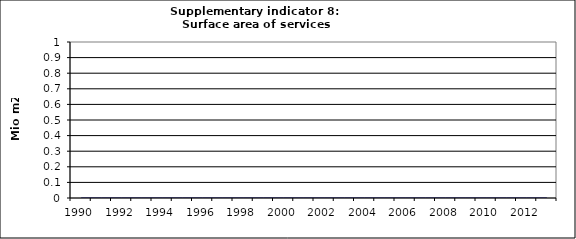
| Category | Surface area of services buildings, Mio m2 |
|---|---|
| 1990 | 0 |
| 1991 | 0 |
| 1992 | 0 |
| 1993 | 0 |
| 1994 | 0 |
| 1995 | 0 |
| 1996 | 0 |
| 1997 | 0 |
| 1998 | 0 |
| 1999 | 0 |
| 2000 | 0 |
| 2001 | 0 |
| 2002 | 0 |
| 2003 | 0 |
| 2004 | 0 |
| 2005 | 0 |
| 2006 | 0 |
| 2007 | 0 |
| 2008 | 0 |
| 2009 | 0 |
| 2010 | 0 |
| 2011 | 0 |
| 2012 | 0 |
| 2013 | 0 |